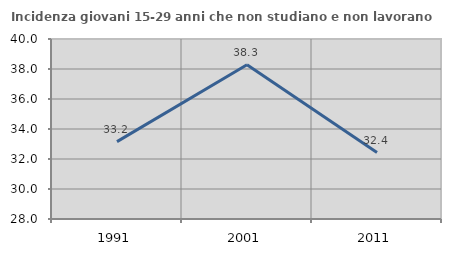
| Category | Incidenza giovani 15-29 anni che non studiano e non lavorano  |
|---|---|
| 1991.0 | 33.158 |
| 2001.0 | 38.289 |
| 2011.0 | 32.428 |